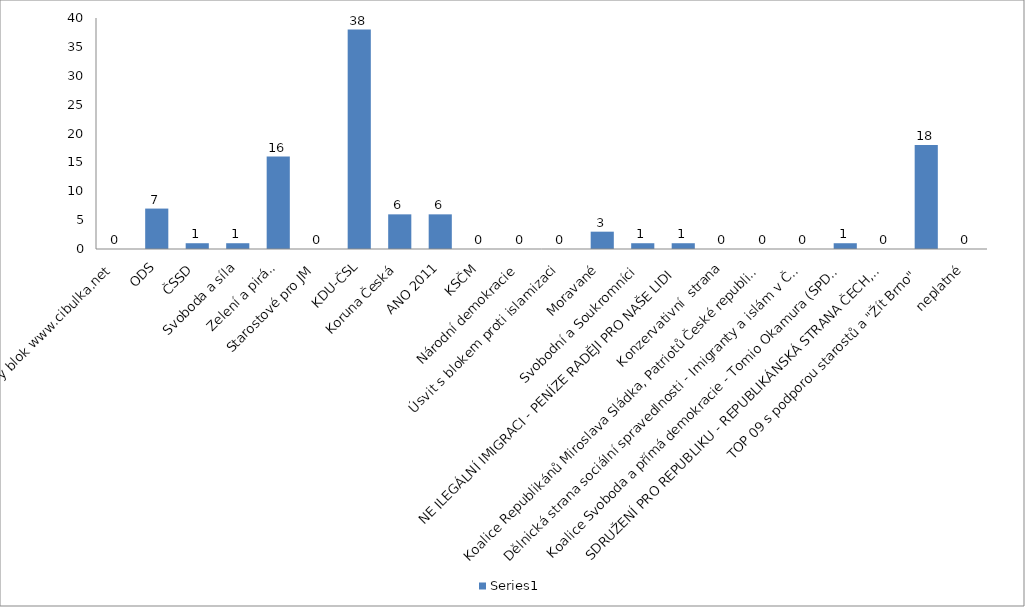
| Category | Series 0 |
|---|---|
| Volte Pravý blok www.cibulka.net | 0 |
| ODS | 7 |
| ČSSD | 1 |
| Svoboda a síla | 1 |
| Zelení a piráti | 16 |
| Starostové pro JM | 0 |
| KDU-ČSL | 38 |
| Koruna Česká | 6 |
| ANO 2011 | 6 |
| KSČM | 0 |
| Národní demokracie | 0 |
| Úsvit s blokem proti islamizaci | 0 |
| Moravané | 3 |
| Svobodní a Soukromníci | 1 |
| NE ILEGÁLNÍ IMIGRACI - PENÍZE RADĚJI PRO NAŠE LIDI | 1 |
| Konzervativní  strana | 0 |
| Koalice Republikánů Miroslava Sládka, Patriotů České republiky a HOZK | 0 |
| Dělnická strana sociální spravedlnosti - Imigranty a islám v ČR nechceme! | 0 |
| Koalice Svoboda a přímá demokracie - Tomio Okamura (SPD) a Strana Práv Občanů | 1 |
| SDRUŽENÍ PRO REPUBLIKU - REPUBLIKÁNSKÁ STRANA ČECH, MORAVY A SLEZSKA | 0 |
| TOP 09 s podporou starostů a "Žít Brno" | 18 |
| neplatné | 0 |